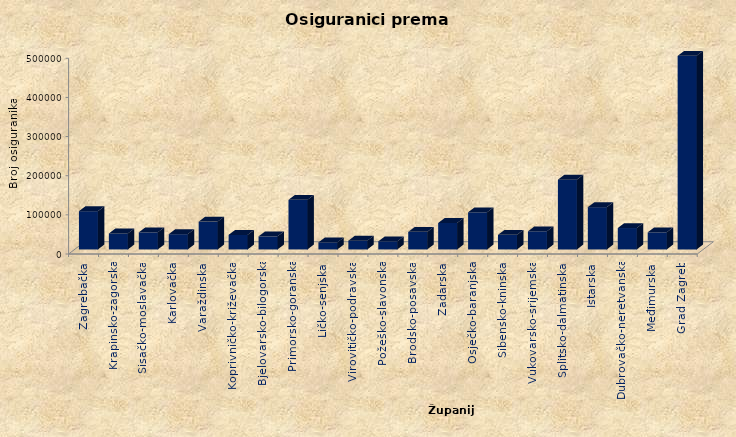
| Category | Series 0 |
|---|---|
| Zagrebačka | 97747 |
| Krapinsko-zagorska | 40848 |
| Sisačko-moslavačka | 43742 |
| Karlovačka | 39021 |
| Varaždinska | 71094 |
| Koprivničko-križevačka | 37194 |
| Bjelovarsko-bilogorska | 33461 |
| Primorsko-goranska | 126805 |
| Ličko-senjska | 18026 |
| Virovitičko-podravska | 22407 |
| Požeško-slavonska | 20592 |
| Brodsko-posavska | 44915 |
| Zadarska | 67608 |
| Osječko-baranjska | 94931 |
| Šibensko-kninska | 37385 |
| Vukovarsko-srijemska | 46403 |
| Splitsko-dalmatinska | 178309 |
| Istarska | 108033 |
| Dubrovačko-neretvanska | 54709 |
| Međimurska | 43764 |
| Grad Zagreb | 494532 |